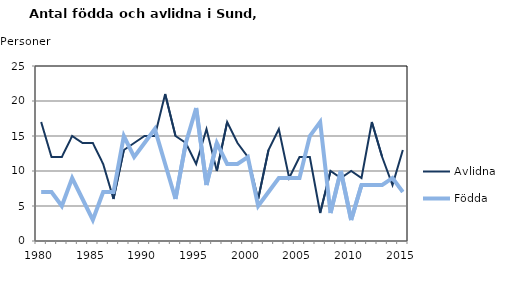
| Category | Avlidna | Födda |
|---|---|---|
| 1980.0 | 17 | 7 |
| 1981.0 | 12 | 7 |
| 1982.0 | 12 | 5 |
| 1983.0 | 15 | 9 |
| 1984.0 | 14 | 6 |
| 1985.0 | 14 | 3 |
| 1986.0 | 11 | 7 |
| 1987.0 | 6 | 7 |
| 1988.0 | 13 | 15 |
| 1989.0 | 14 | 12 |
| 1990.0 | 15 | 14 |
| 1991.0 | 15 | 16 |
| 1992.0 | 21 | 11 |
| 1993.0 | 15 | 6 |
| 1994.0 | 14 | 14 |
| 1995.0 | 11 | 19 |
| 1996.0 | 16 | 8 |
| 1997.0 | 10 | 14 |
| 1998.0 | 17 | 11 |
| 1999.0 | 14 | 11 |
| 2000.0 | 12 | 12 |
| 2001.0 | 6 | 5 |
| 2002.0 | 13 | 7 |
| 2003.0 | 16 | 9 |
| 2004.0 | 9 | 9 |
| 2005.0 | 12 | 9 |
| 2006.0 | 12 | 15 |
| 2007.0 | 4 | 17 |
| 2008.0 | 10 | 4 |
| 2009.0 | 9 | 10 |
| 2010.0 | 10 | 3 |
| 2011.0 | 9 | 8 |
| 2012.0 | 17 | 8 |
| 2013.0 | 12 | 8 |
| 2014.0 | 8 | 9 |
| 2015.0 | 13 | 7 |